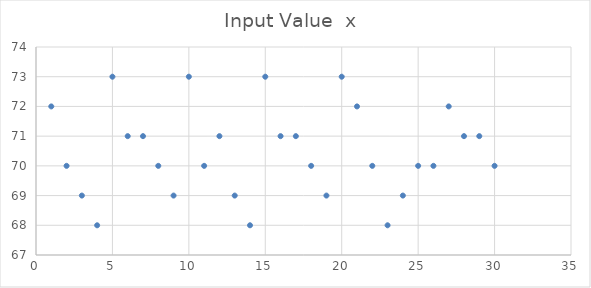
| Category | Input Value  x  |
|---|---|
| 1.0 | 72 |
| 2.0 | 70 |
| 3.0 | 69 |
| 4.0 | 68 |
| 5.0 | 73 |
| 6.0 | 71 |
| 7.0 | 71 |
| 8.0 | 70 |
| 9.0 | 69 |
| 10.0 | 73 |
| 11.0 | 70 |
| 12.0 | 71 |
| 13.0 | 69 |
| 14.0 | 68 |
| 15.0 | 73 |
| 16.0 | 71 |
| 17.0 | 71 |
| 18.0 | 70 |
| 19.0 | 69 |
| 20.0 | 73 |
| 21.0 | 72 |
| 22.0 | 70 |
| 23.0 | 68 |
| 24.0 | 69 |
| 25.0 | 70 |
| 26.0 | 70 |
| 27.0 | 72 |
| 28.0 | 71 |
| 29.0 | 71 |
| 30.0 | 70 |